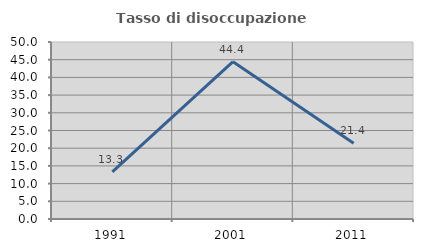
| Category | Tasso di disoccupazione giovanile  |
|---|---|
| 1991.0 | 13.333 |
| 2001.0 | 44.444 |
| 2011.0 | 21.429 |